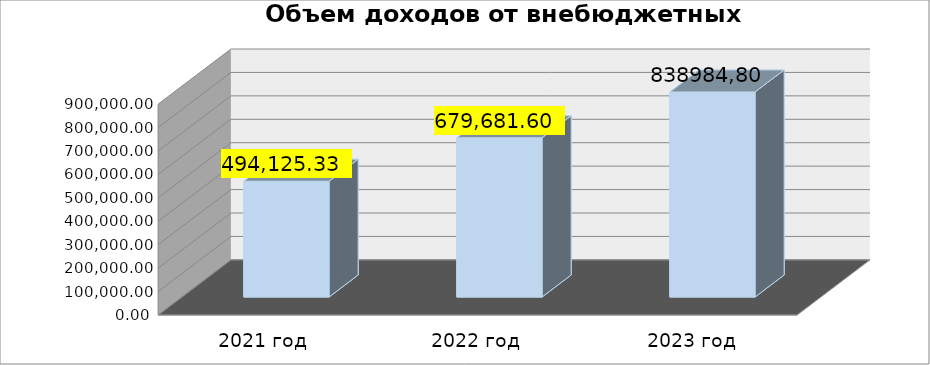
| Category | Series 0 |
|---|---|
| 2021 год | 494125.33 |
| 2022 год | 679681.6 |
|  2023 год | 875106.1 |